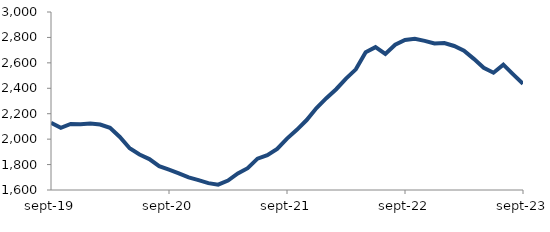
| Category | Series 0 |
|---|---|
| 2019-09-01 | 2128.491 |
| 2019-10-01 | 2088.553 |
| 2019-11-01 | 2119.211 |
| 2019-12-01 | 2116.27 |
| 2020-01-01 | 2123.179 |
| 2020-02-01 | 2115.217 |
| 2020-03-01 | 2088.6 |
| 2020-04-01 | 2017.241 |
| 2020-05-01 | 1928.116 |
| 2020-06-01 | 1878.979 |
| 2020-07-01 | 1843.29 |
| 2020-08-01 | 1787.543 |
| 2020-09-01 | 1760.281 |
| 2020-10-01 | 1731.197 |
| 2020-11-01 | 1698.835 |
| 2020-12-01 | 1677.184 |
| 2021-01-01 | 1654.072 |
| 2021-02-01 | 1641.869 |
| 2021-03-01 | 1673.821 |
| 2021-04-01 | 1730.759 |
| 2021-05-01 | 1771.425 |
| 2021-06-01 | 1846.573 |
| 2021-07-01 | 1874.111 |
| 2021-08-01 | 1922.894 |
| 2021-09-01 | 2004.225 |
| 2021-10-01 | 2073.331 |
| 2021-11-01 | 2150.314 |
| 2021-12-01 | 2244.492 |
| 2022-01-01 | 2321.95 |
| 2022-02-01 | 2392.65 |
| 2022-03-01 | 2476.383 |
| 2022-04-01 | 2549.069 |
| 2022-05-01 | 2683.336 |
| 2022-06-01 | 2723.868 |
| 2022-07-01 | 2670.585 |
| 2022-08-01 | 2742.913 |
| 2022-09-01 | 2780.46 |
| 2022-10-01 | 2788.916 |
| 2022-11-01 | 2772.628 |
| 2022-12-01 | 2752.307 |
| 2023-01-01 | 2755.69 |
| 2023-02-01 | 2732.653 |
| 2023-03-01 | 2696.107 |
| 2023-04-01 | 2631.454 |
| 2023-05-01 | 2561.826 |
| 2023-06-01 | 2522.703 |
| 2023-07-01 | 2586.296 |
| 2023-08-01 | 2509.777 |
| 2023-09-01 | 2436.109 |